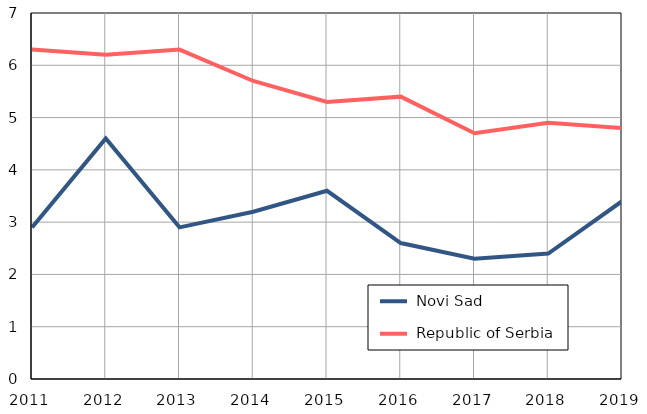
| Category |  Novi Sad |  Republic of Serbia |
|---|---|---|
| 2011.0 | 2.9 | 6.3 |
| 2012.0 | 4.6 | 6.2 |
| 2013.0 | 2.9 | 6.3 |
| 2014.0 | 3.2 | 5.7 |
| 2015.0 | 3.6 | 5.3 |
| 2016.0 | 2.6 | 5.4 |
| 2017.0 | 2.3 | 4.7 |
| 2018.0 | 2.4 | 4.9 |
| 2019.0 | 3.4 | 4.8 |